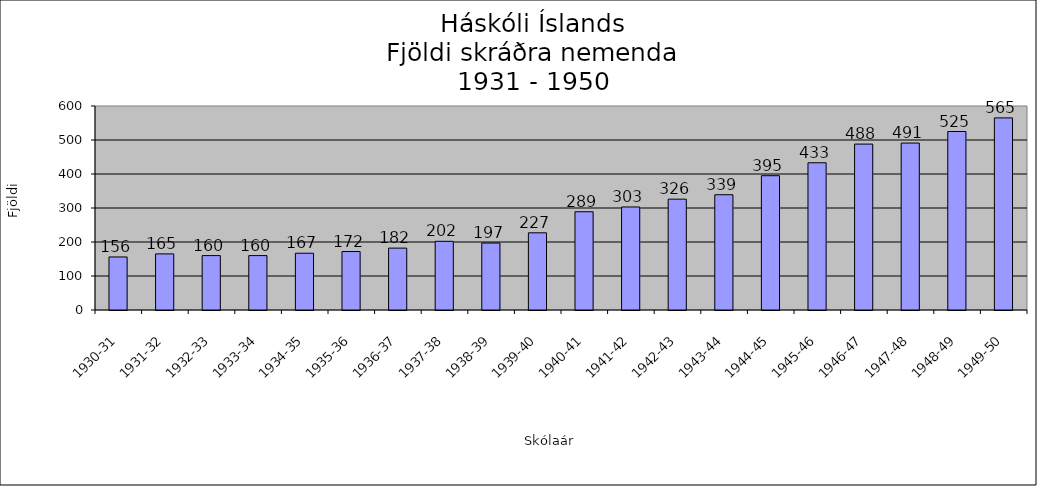
| Category | Series 0 |
|---|---|
| 1930-31 | 156 |
| 1931-32 | 165 |
| 1932-33 | 160 |
| 1933-34 | 160 |
| 1934-35 | 167 |
| 1935-36 | 172 |
| 1936-37 | 182 |
| 1937-38 | 202 |
| 1938-39 | 197 |
| 1939-40 | 227 |
| 1940-41 | 289 |
| 1941-42 | 303 |
| 1942-43 | 326 |
| 1943-44 | 339 |
| 1944-45 | 395 |
| 1945-46 | 433 |
| 1946-47 | 488 |
| 1947-48 | 491 |
| 1948-49 | 525 |
| 1949-50 | 565 |